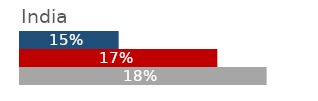
| Category | India |
|---|---|
| 2006 | 0.15 |
| 2011 | 0.17 |
| 2016 | 0.18 |